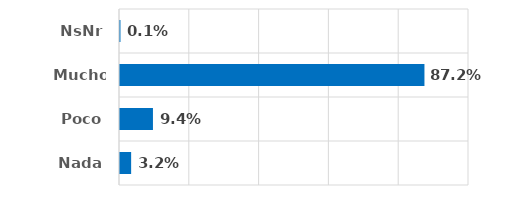
| Category | Series 0 |
|---|---|
| Nada | 0.032 |
| Poco | 0.094 |
| Mucho | 0.872 |
| NsNr | 0.001 |